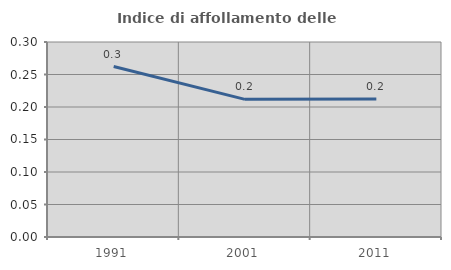
| Category | Indice di affollamento delle abitazioni  |
|---|---|
| 1991.0 | 0.262 |
| 2001.0 | 0.212 |
| 2011.0 | 0.212 |